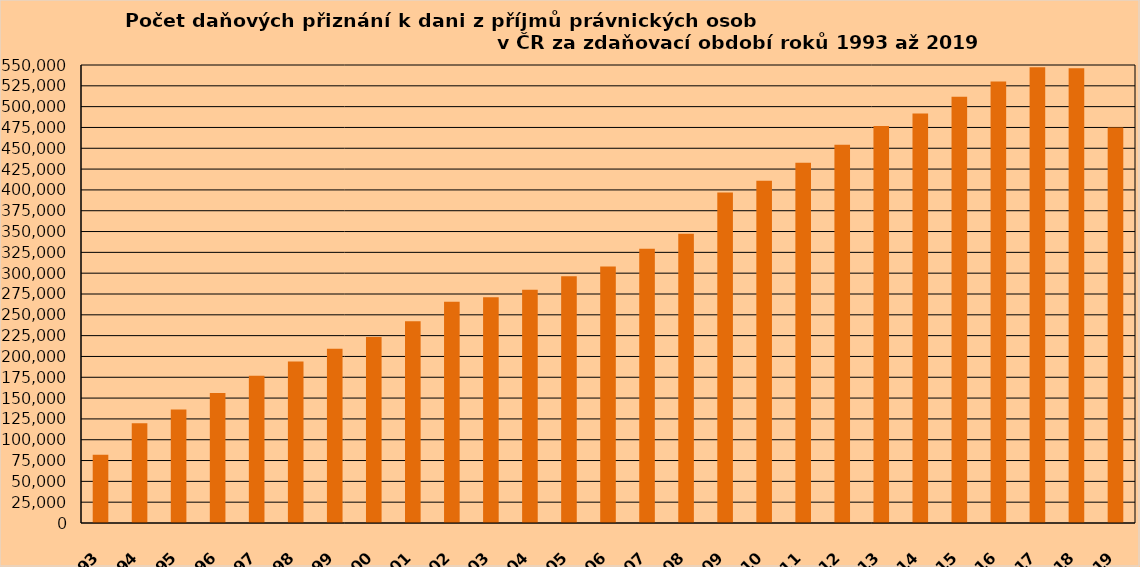
| Category | 81 950 |
|---|---|
| 1993 | 81950 |
| 1994 | 119831 |
| 1995 | 136334 |
| 1996 | 156029 |
| 1997 | 176934 |
| 1998 | 193797 |
| 1999 | 209106 |
| 2000 | 223307 |
| 2001 | 242164 |
| 2002 | 265813 |
| 2003 | 270968 |
| 2004 | 279964 |
| 2005 | 296271 |
| 2006 | 307986 |
| 2007 | 329481 |
| 2008 | 347457 |
| 2009 | 396925 |
| 2010 | 411060 |
| *2011 | 432741 |
| 2012 | 454172 |
| 2013 | 476797 |
| 2014 | 491878 |
| 2015 | 511743 |
| 2016 | 530296 |
| 2017 | 547408 |
| 2018 | 546174 |
| 2019 | 474939 |